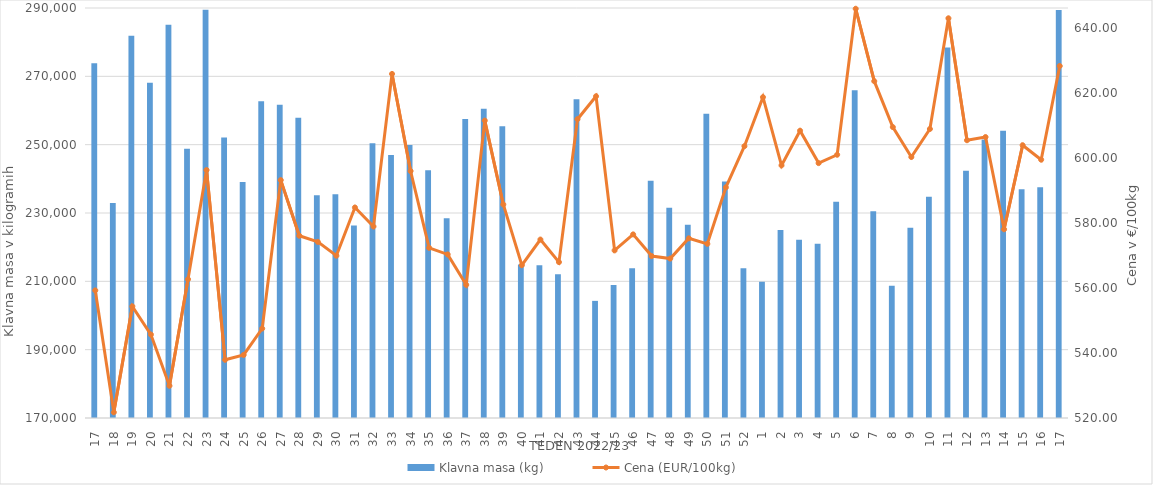
| Category | Klavna masa (kg) |
|---|---|
| 17.0 | 273824 |
| 18.0 | 232926 |
| 19.0 | 281859 |
| 20.0 | 268153 |
| 21.0 | 285073 |
| 22.0 | 248783 |
| 23.0 | 289478 |
| 24.0 | 252069 |
| 25.0 | 239099 |
| 26.0 | 262689 |
| 27.0 | 261656 |
| 28.0 | 257905 |
| 29.0 | 235185 |
| 30.0 | 235475 |
| 31.0 | 226322 |
| 32.0 | 250418 |
| 33.0 | 246996 |
| 34.0 | 249873 |
| 35.0 | 242516 |
| 36.0 | 228469 |
| 37.0 | 257511 |
| 38.0 | 260481 |
| 39.0 | 255370 |
| 40.0 | 214936 |
| 41.0 | 214672 |
| 42.0 | 212066 |
| 43.0 | 263287 |
| 44.0 | 204280 |
| 45.0 | 208920 |
| 46.0 | 213836 |
| 47.0 | 239417 |
| 48.0 | 231565 |
| 49.0 | 226575 |
| 50.0 | 259073 |
| 51.0 | 239211 |
| 52.0 | 213841 |
| 1.0 | 209877 |
| 2.0 | 225045 |
| 3.0 | 222198 |
| 4.0 | 221002 |
| 5.0 | 233306 |
| 6.0 | 265944 |
| 7.0 | 230531 |
| 8.0 | 208699 |
| 9.0 | 225712 |
| 10.0 | 234762 |
| 11.0 | 278467 |
| 12.0 | 242369 |
| 13.0 | 251507 |
| 14.0 | 254072 |
| 15.0 | 236964 |
| 16.0 | 237552 |
| 17.0 | 289400 |